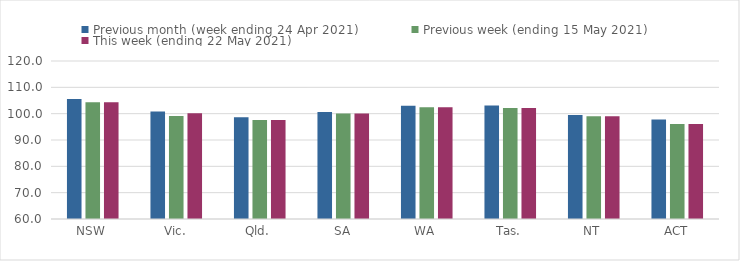
| Category | Previous month (week ending 24 Apr 2021) | Previous week (ending 15 May 2021) | This week (ending 22 May 2021) |
|---|---|---|---|
| NSW | 105.61 | 104.34 | 104.34 |
| Vic. | 100.81 | 99.15 | 100.19 |
| Qld. | 98.63 | 97.56 | 97.56 |
| SA | 100.62 | 100.1 | 100.1 |
| WA | 103.02 | 102.42 | 102.42 |
| Tas. | 103.14 | 102.15 | 102.15 |
| NT | 99.5 | 99 | 99 |
| ACT | 97.81 | 96.06 | 96.06 |